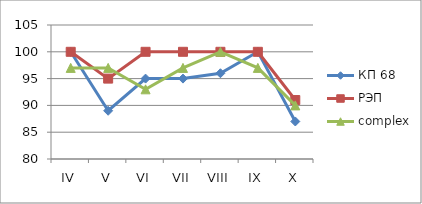
| Category | КП 68 | РЭП  | complex |
|---|---|---|---|
| IV | 100 | 100 | 97 |
| V | 89 | 95 | 97 |
| VI | 95 | 100 | 93 |
| VII | 95 | 100 | 97 |
| VIII | 96 | 100 | 100 |
| IX | 100 | 100 | 97 |
| X | 87 | 91 | 90 |